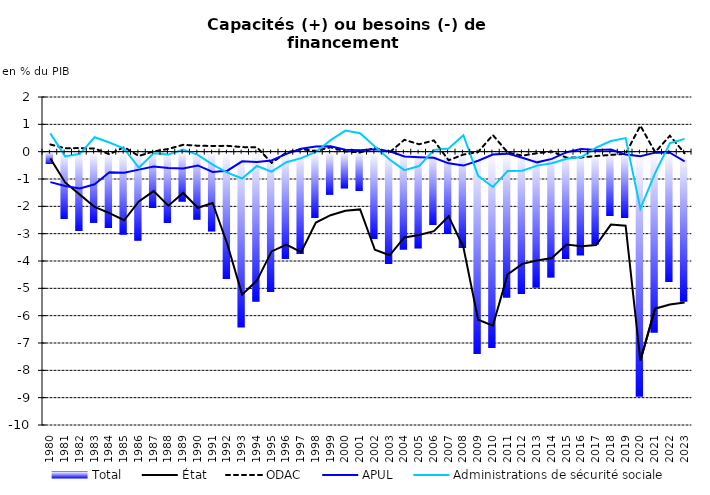
| Category | Total |
|---|---|
| 1980.0 | -0.433 |
| 1981.0 | -2.432 |
| 1982.0 | -2.869 |
| 1983.0 | -2.571 |
| 1984.0 | -2.765 |
| 1985.0 | -3.004 |
| 1986.0 | -3.225 |
| 1987.0 | -2.032 |
| 1988.0 | -2.585 |
| 1989.0 | -1.797 |
| 1990.0 | -2.456 |
| 1991.0 | -2.886 |
| 1992.0 | -4.64 |
| 1993.0 | -6.4 |
| 1994.0 | -5.455 |
| 1995.0 | -5.111 |
| 1996.0 | -3.896 |
| 1997.0 | -3.711 |
| 1998.0 | -2.391 |
| 1999.0 | -1.544 |
| 2000.0 | -1.313 |
| 2001.0 | -1.417 |
| 2002.0 | -3.176 |
| 2003.0 | -4.088 |
| 2004.0 | -3.555 |
| 2005.0 | -3.507 |
| 2006.0 | -2.658 |
| 2007.0 | -2.99 |
| 2008.0 | -3.502 |
| 2009.0 | -7.379 |
| 2010.0 | -7.152 |
| 2011.0 | -5.305 |
| 2012.0 | -5.171 |
| 2013.0 | -4.938 |
| 2014.0 | -4.574 |
| 2015.0 | -3.892 |
| 2016.0 | -3.765 |
| 2017.0 | -3.362 |
| 2018.0 | -2.319 |
| 2019.0 | -2.394 |
| 2020.0 | -8.933 |
| 2021.0 | -6.585 |
| 2022.0 | -4.737 |
| 2023.0 | -5.454 |